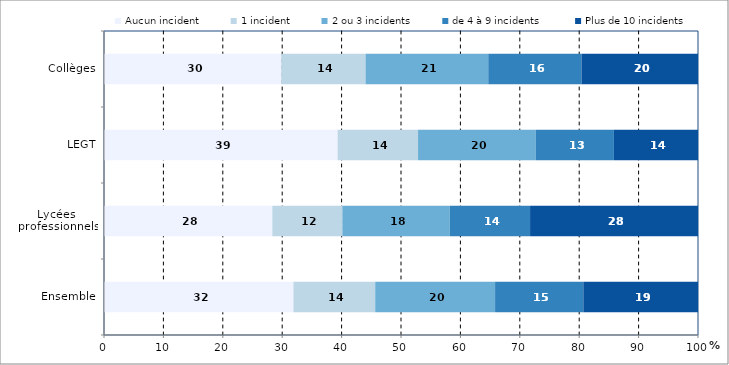
| Category | Aucun incident | 1 incident | 2 ou 3 incidents | de 4 à 9 incidents  | Plus de 10 incidents |
|---|---|---|---|---|---|
| Ensemble | 31.89 | 13.77 | 20.18 | 14.86 | 19.3 |
| Lycées 
professionnels | 28.34 | 11.79 | 18.07 | 13.53 | 28.27 |
| LEGT | 39.33 | 13.54 | 19.83 | 13.14 | 14.16 |
| Collèges | 29.84 | 14.19 | 20.66 | 15.7 | 19.61 |